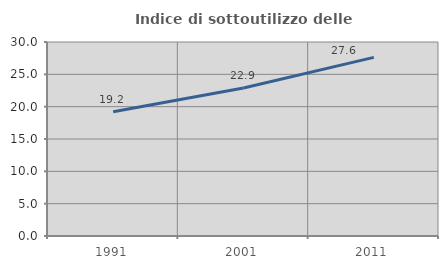
| Category | Indice di sottoutilizzo delle abitazioni  |
|---|---|
| 1991.0 | 19.2 |
| 2001.0 | 22.892 |
| 2011.0 | 27.62 |